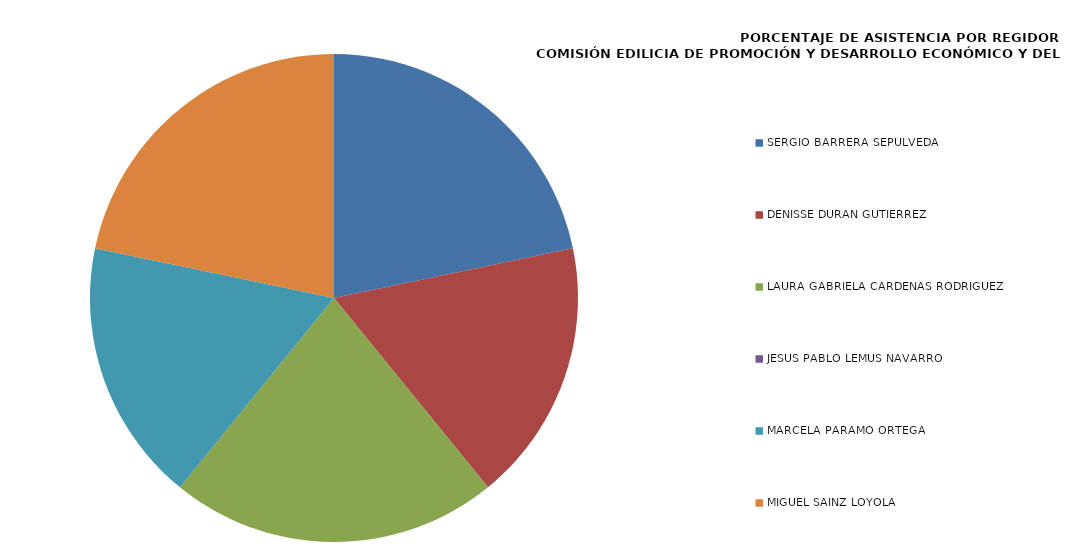
| Category | Series 0 |
|---|---|
| SERGIO BARRERA SEPÚLVEDA | 100 |
| DENISSE DURÁN GUTIÉRREZ | 80 |
| LAURA GABRIELA CÁRDENAS RODRÍGUEZ | 100 |
| JESÚS PABLO LEMUS NAVARRO | 0 |
| MARCELA PÁRAMO ORTEGA | 80 |
| MIGUEL SAINZ LOYOLA | 100 |